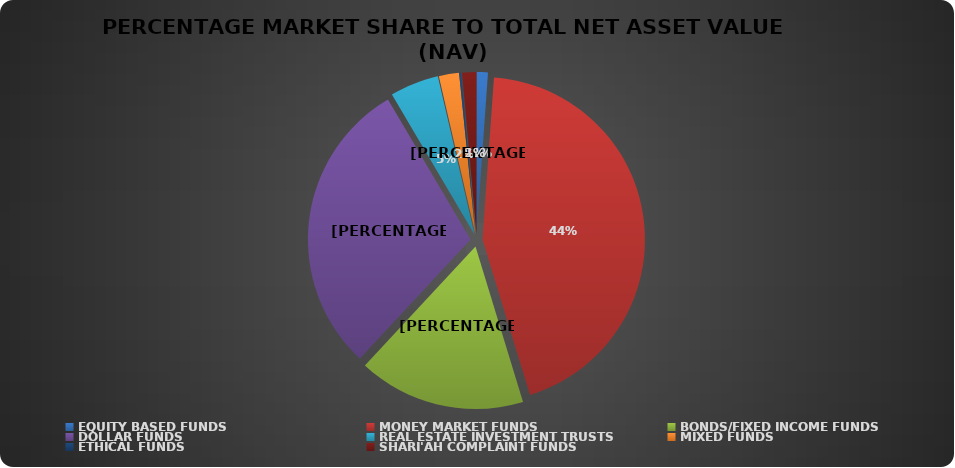
| Category | NET ASSET VALUE |
|---|---|
| EQUITY BASED FUNDS | 21710538133.9 |
| MONEY MARKET FUNDS | 849994179796.462 |
| BONDS/FIXED INCOME FUNDS | 320399612573.656 |
| DOLLAR FUNDS | 569956762301.137 |
| REAL ESTATE INVESTMENT TRUSTS | 93558457831.73 |
| MIXED FUNDS | 38690467865.718 |
| ETHICAL FUNDS | 3765883383.12 |
| SHARI'AH COMPLAINT FUNDS | 27315712442.81 |